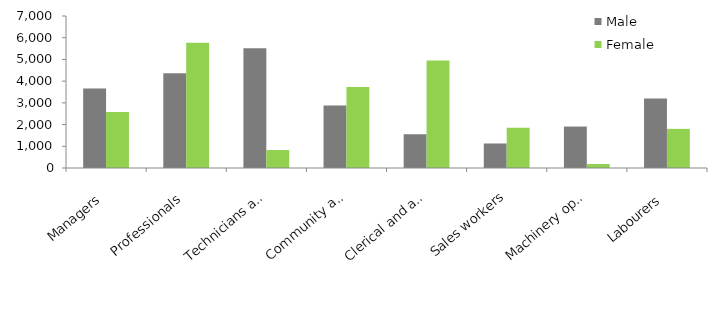
| Category | Male | Female |
|---|---|---|
| Managers | 3659 | 2581 |
| Professionals | 4360 | 5766 |
| Technicians and trades workers | 5515 | 827 |
| Community and personal service workers | 2881 | 3728 |
| Clerical and administrative workers | 1555 | 4947 |
| Sales workers | 1129 | 1854 |
| Machinery operators and drivers | 1909 | 184 |
| Labourers | 3205 | 1802 |